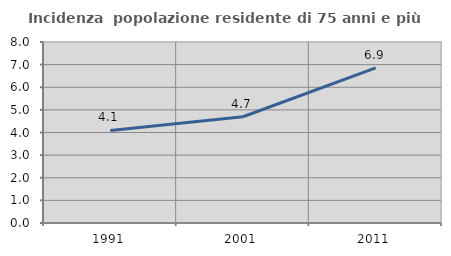
| Category | Incidenza  popolazione residente di 75 anni e più |
|---|---|
| 1991.0 | 4.09 |
| 2001.0 | 4.695 |
| 2011.0 | 6.86 |